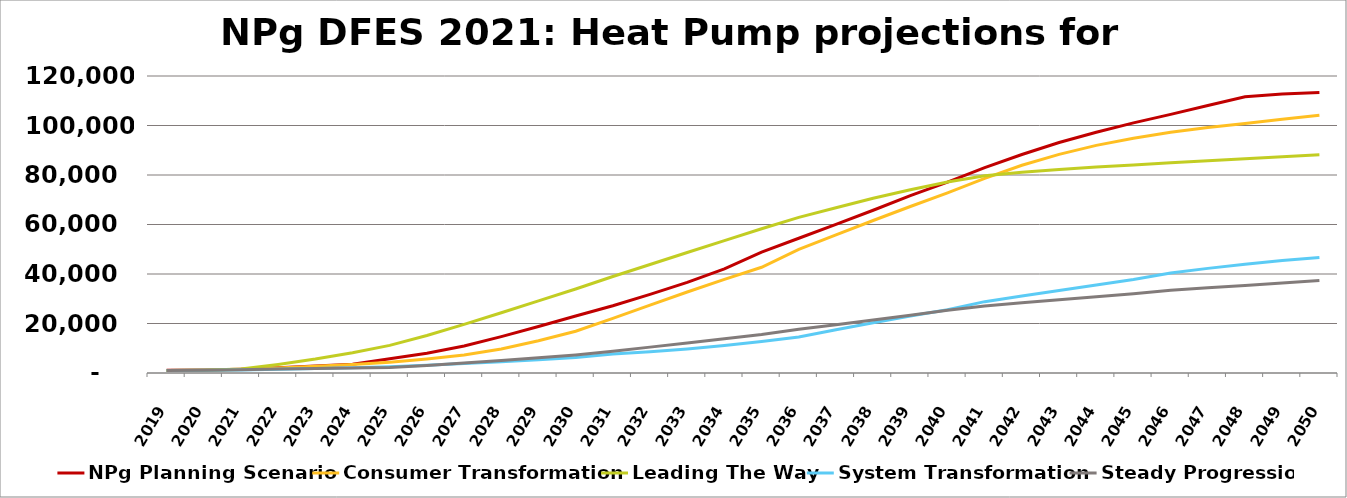
| Category | NPg Planning Scenario | Consumer Transformation | Leading The Way | System Transformation | Steady Progression |
|---|---|---|---|---|---|
| 2019.0 | 1088 | 988 | 988 | 988 | 988 |
| 2020.0 | 1198 | 1160 | 1160 | 1160 | 1160 |
| 2021.0 | 1483 | 1453 | 1597 | 1166 | 1348 |
| 2022.0 | 2094 | 2046 | 3450 | 1496 | 1583 |
| 2023.0 | 2803 | 2691 | 5637 | 1829 | 1796 |
| 2024.0 | 3526 | 3445 | 8212 | 2163 | 2009 |
| 2025.0 | 5775 | 4338 | 11165 | 2510 | 2217 |
| 2026.0 | 7957 | 5681 | 15150 | 3120 | 3072 |
| 2027.0 | 10880 | 7274 | 19635 | 3793 | 3997 |
| 2028.0 | 14688 | 9673 | 24359 | 4520 | 5005 |
| 2029.0 | 18796 | 13031 | 29116 | 5328 | 6119 |
| 2030.0 | 23049 | 16881 | 33937 | 6251 | 7321 |
| 2031.0 | 27192 | 22044 | 38974 | 7667 | 8805 |
| 2032.0 | 31786 | 27425 | 43853 | 8553 | 10458 |
| 2033.0 | 36611 | 32726 | 48682 | 9726 | 12139 |
| 2034.0 | 42088 | 37801 | 53488 | 11131 | 13846 |
| 2035.0 | 48831 | 42734 | 58290 | 12768 | 15570 |
| 2036.0 | 54451 | 49967 | 62892 | 14535 | 17638 |
| 2037.0 | 60047 | 55822 | 66748 | 17503 | 19512 |
| 2038.0 | 65750 | 61614 | 70615 | 20330 | 21420 |
| 2039.0 | 71650 | 67279 | 74028 | 23034 | 23350 |
| 2040.0 | 77089 | 72813 | 77179 | 25547 | 25317 |
| 2041.0 | 82951 | 78615 | 79668 | 28827 | 27068 |
| 2042.0 | 88293 | 83942 | 81155 | 31086 | 28347 |
| 2043.0 | 93107 | 88326 | 82208 | 33348 | 29597 |
| 2044.0 | 97285 | 91980 | 83185 | 35582 | 30789 |
| 2045.0 | 101058 | 94819 | 84036 | 37756 | 31983 |
| 2046.0 | 104506 | 97247 | 84960 | 40406 | 33451 |
| 2047.0 | 108100 | 99199 | 85763 | 42269 | 34412 |
| 2048.0 | 111637 | 100831 | 86608 | 43968 | 35374 |
| 2049.0 | 112709 | 102483 | 87390 | 45447 | 36354 |
| 2050.0 | 113369 | 104145 | 88155 | 46713 | 37354 |